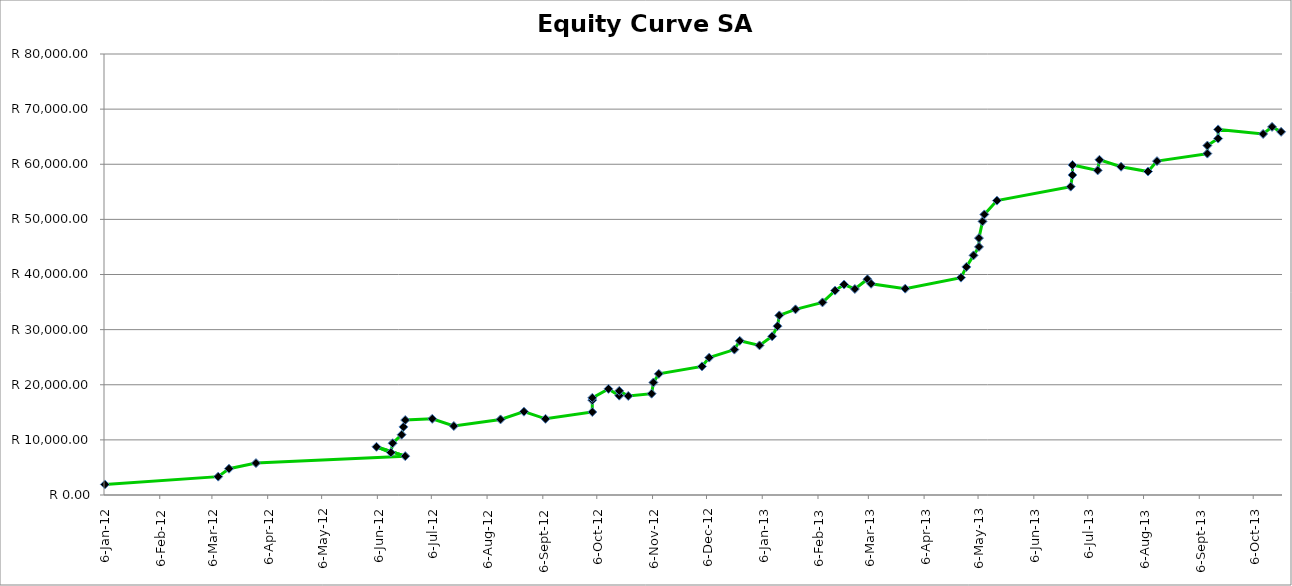
| Category | Date |
|---|---|
| 2012-01-06 | 1912.771 |
| 2012-03-09 | 3330.012 |
| 2012-03-15 | 4766.287 |
| 2012-03-30 | 5792.888 |
| 2012-06-21 | 7045.374 |
| 2012-06-05 | 8744.84 |
| 2012-06-13 | 7714.462 |
| 2012-06-14 | 9390.903 |
| 2012-06-19 | 10940.574 |
| 2012-06-20 | 12350.444 |
| 2012-06-21 | 13602.931 |
| 2012-07-06 | 13823.377 |
| 2012-07-18 | 12510.977 |
| 2012-08-13 | 13711.88 |
| 2012-08-26 | 15116.061 |
| 2012-09-07 | 13820.299 |
| 2012-10-03 | 15054.902 |
| 2012-10-03 | 17208.402 |
| 2012-10-03 | 17623.166 |
| 2012-10-12 | 19248.916 |
| 2012-10-18 | 18015.393 |
| 2012-10-18 | 18891.046 |
| 2012-10-23 | 17961.821 |
| 2012-11-05 | 18383.238 |
| 2012-11-06 | 20413.743 |
| 2012-11-09 | 21978.05 |
| 2012-12-03 | 23329.9 |
| 2012-12-07 | 24925.245 |
| 2012-12-21 | 26374.332 |
| 2012-12-24 | 27974.319 |
| 2013-01-04 | 27139.677 |
| 2013-01-11 | 28784.52 |
| 2013-01-14 | 30632.535 |
| 2013-01-15 | 32581.112 |
| 2013-01-24 | 33681.611 |
| 2013-02-08 | 34934.958 |
| 2013-02-15 | 37083.306 |
| 2013-02-20 | 38180.582 |
| 2013-02-26 | 37371.705 |
| 2013-03-05 | 39146.432 |
| 2013-03-07 | 38320.293 |
| 2013-03-26 | 37426.948 |
| 2013-04-26 | 39430.569 |
| 2013-04-29 | 41372.405 |
| 2013-05-03 | 43467.929 |
| 2013-05-06 | 45008.438 |
| 2013-05-06 | 46602.175 |
| 2013-05-08 | 49628.368 |
| 2013-05-09 | 50901.927 |
| 2013-05-16 | 53404.666 |
| 2013-06-26 | 55937.7 |
| 2013-06-27 | 58050.242 |
| 2013-06-27 | 59868.392 |
| 2013-07-11 | 58885.596 |
| 2013-07-12 | 60808.942 |
| 2013-07-24 | 59552.472 |
| 2013-08-08 | 58682.595 |
| 2013-08-13 | 60564.948 |
| 2013-09-10 | 61929.667 |
| 2013-09-10 | 63389.997 |
| 2013-09-16 | 64660.532 |
| 2013-09-16 | 66320.304 |
| 2013-10-11 | 65498.88 |
| 2013-10-16 | 66777.324 |
| 2013-10-21 | 65877.752 |